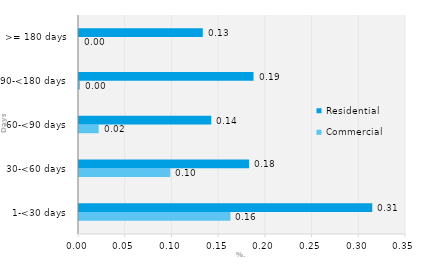
| Category | Commercial | Residential |
|---|---|---|
| 1-<30 days | 0.162 | 0.314 |
| 30-<60 days | 0.098 | 0.182 |
| 60-<90 days | 0.021 | 0.142 |
| 90-<180 days | 0.001 | 0.187 |
| >= 180 days | 0 | 0.132 |